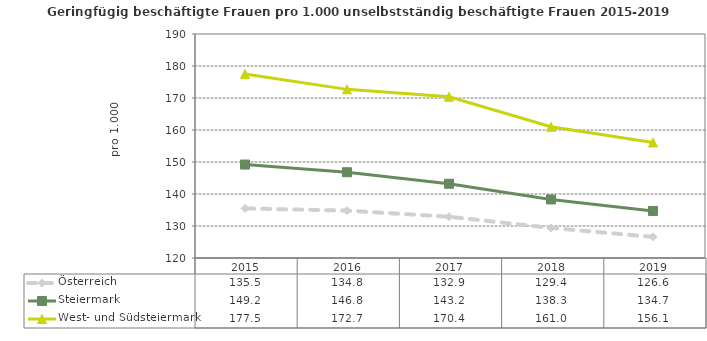
| Category | Österreich | Steiermark | West- und Südsteiermark |
|---|---|---|---|
| 2019.0 | 126.6 | 134.7 | 156.1 |
| 2018.0 | 129.4 | 138.3 | 161 |
| 2017.0 | 132.9 | 143.2 | 170.4 |
| 2016.0 | 134.8 | 146.8 | 172.7 |
| 2015.0 | 135.5 | 149.2 | 177.5 |